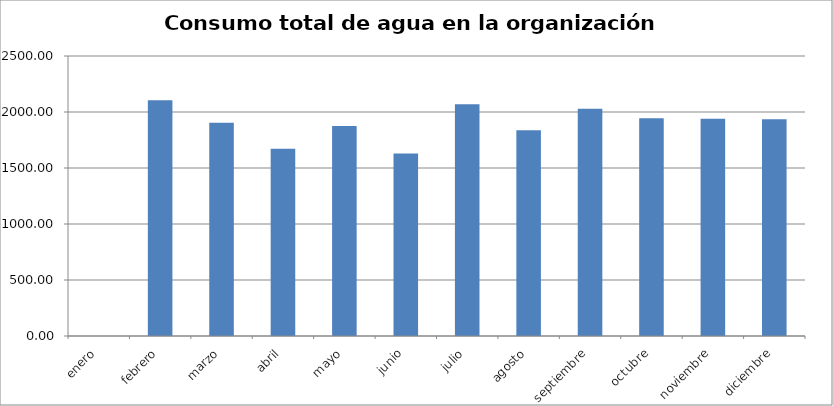
| Category | Series 0 |
|---|---|
| enero | 0 |
| febrero | 2104 |
| marzo | 1904 |
| abril | 1672 |
| mayo | 1876 |
| junio | 1629 |
| julio | 2069 |
| agosto | 1837 |
| septiembre | 2030 |
| octubre | 1945 |
| noviembre | 1939 |
| diciembre | 1935 |